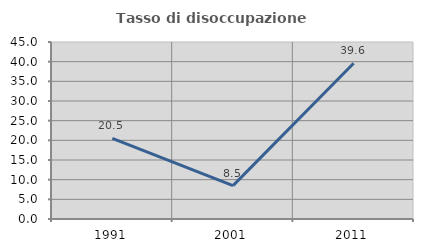
| Category | Tasso di disoccupazione giovanile  |
|---|---|
| 1991.0 | 20.482 |
| 2001.0 | 8.475 |
| 2011.0 | 39.583 |